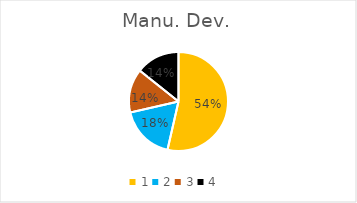
| Category | Series 0 |
|---|---|
| 0 | 0.536 |
| 1 | 0.179 |
| 2 | 0.143 |
| 3 | 0.143 |